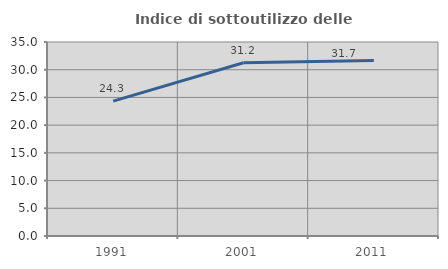
| Category | Indice di sottoutilizzo delle abitazioni  |
|---|---|
| 1991.0 | 24.334 |
| 2001.0 | 31.247 |
| 2011.0 | 31.685 |